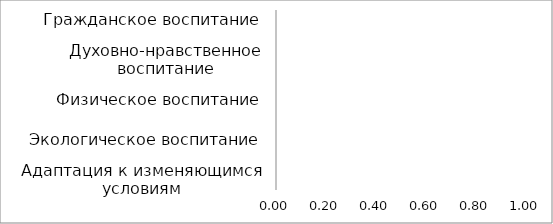
| Category | Series 0 |
|---|---|
| Гражданское воспитание | 0 |
| Патриотическое воспитание | 0 |
| Духовно-нравственное воспитание | 0 |
| Эстетическое воспитания | 0 |
| Физическое воспитание | 0 |
| Трудовое воспитание | 0 |
| Экологическое воспитание | 0 |
| Ценность научного познания | 0 |
| Адаптация к изменяющимся условиям | 0 |